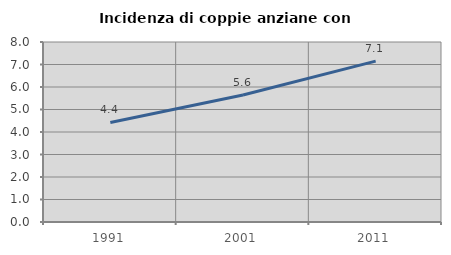
| Category | Incidenza di coppie anziane con figli |
|---|---|
| 1991.0 | 4.426 |
| 2001.0 | 5.641 |
| 2011.0 | 7.149 |